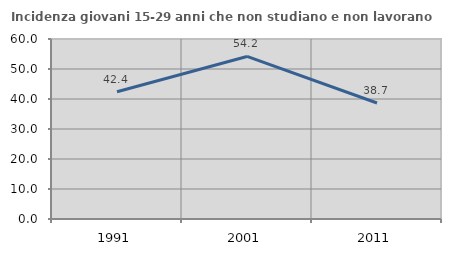
| Category | Incidenza giovani 15-29 anni che non studiano e non lavorano  |
|---|---|
| 1991.0 | 42.424 |
| 2001.0 | 54.184 |
| 2011.0 | 38.674 |